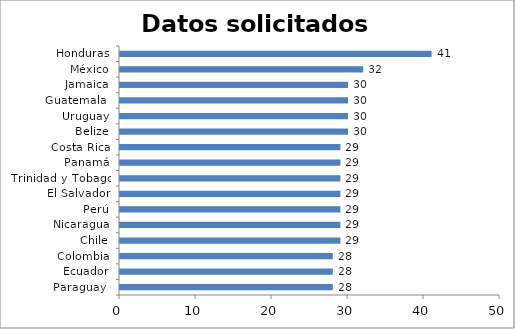
| Category | Series 0 |
|---|---|
| Paraguay  | 28 |
| Ecuador | 28 |
| Colombia | 28 |
| Chile | 29 |
| Nicaragua | 29 |
| Perú | 29 |
| El Salvador | 29 |
| Trinidad y Tobago | 29 |
| Panamá | 29 |
| Costa Rica | 29 |
| Belize | 30 |
| Uruguay | 30 |
| Guatemala  | 30 |
| Jamaica | 30 |
| México | 32 |
| Honduras | 41 |